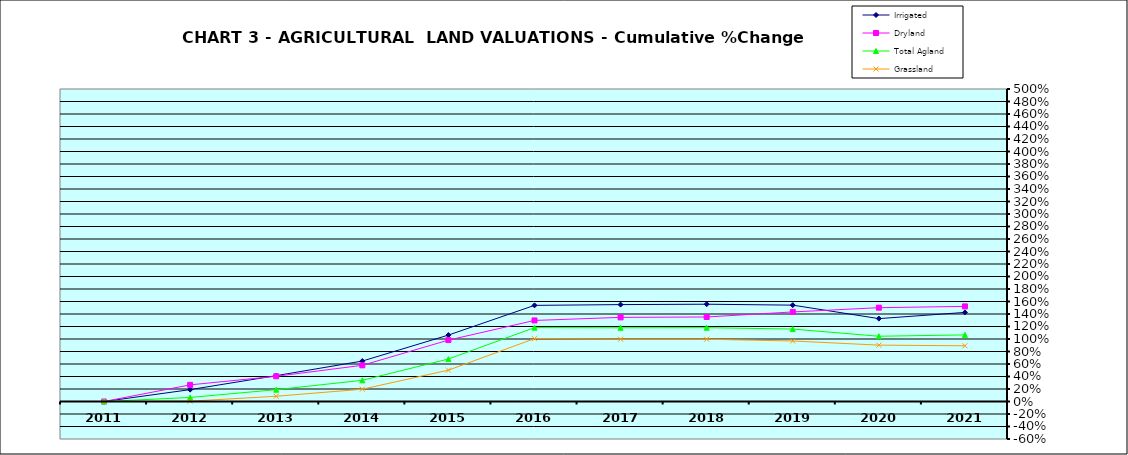
| Category | Irrigated | Dryland | Total Agland | Grassland |
|---|---|---|---|---|
| 2011.0 | 0 | 0 | 0 | 0 |
| 2012.0 | 0.19 | 0.266 | 0.065 | 0.005 |
| 2013.0 | 0.414 | 0.404 | 0.189 | 0.084 |
| 2014.0 | 0.647 | 0.579 | 0.339 | 0.197 |
| 2015.0 | 1.063 | 0.982 | 0.68 | 0.502 |
| 2016.0 | 1.538 | 1.297 | 1.182 | 1.006 |
| 2017.0 | 1.55 | 1.346 | 1.179 | 0.997 |
| 2018.0 | 1.557 | 1.352 | 1.181 | 0.996 |
| 2019.0 | 1.542 | 1.433 | 1.159 | 0.968 |
| 2020.0 | 1.326 | 1.501 | 1.044 | 0.902 |
| 2021.0 | 1.425 | 1.522 | 1.066 | 0.891 |